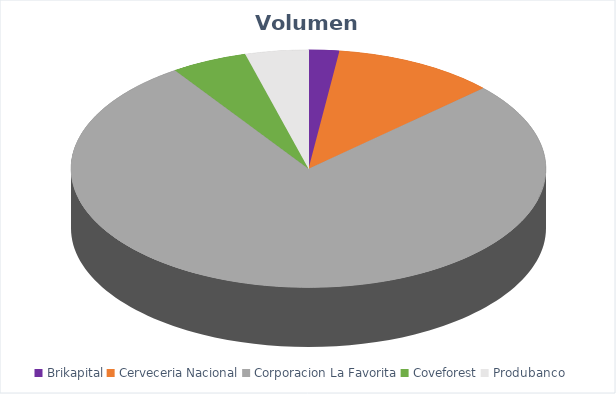
| Category | VOLUMEN ($USD) |
|---|---|
| Brikapital | 2000 |
| Cerveceria Nacional | 10647 |
| Corporacion La Favorita | 74486.98 |
| Coveforest | 5002.4 |
| Produbanco | 4130 |